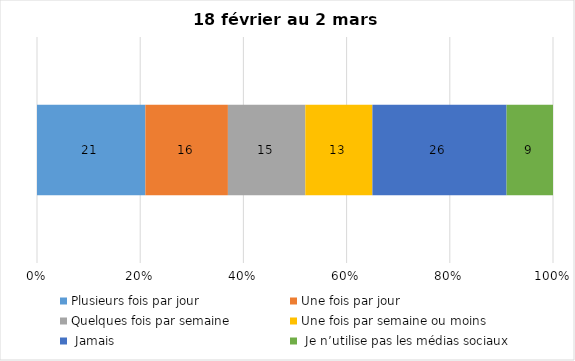
| Category | Plusieurs fois par jour | Une fois par jour | Quelques fois par semaine   | Une fois par semaine ou moins   |  Jamais   |  Je n’utilise pas les médias sociaux |
|---|---|---|---|---|---|---|
| 0 | 21 | 16 | 15 | 13 | 26 | 9 |